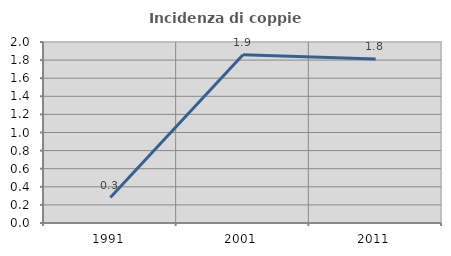
| Category | Incidenza di coppie miste |
|---|---|
| 1991.0 | 0.282 |
| 2001.0 | 1.86 |
| 2011.0 | 1.813 |